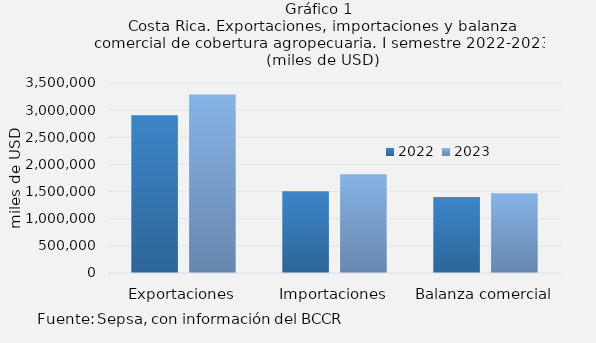
| Category | 2022 | 2023 |
|---|---|---|
| Exportaciones | 2906089.095 | 3289873.905 |
| Importaciones | 1508118.434 | 1819479.721 |
| Balanza comercial | 1397970.662 | 1470394.184 |